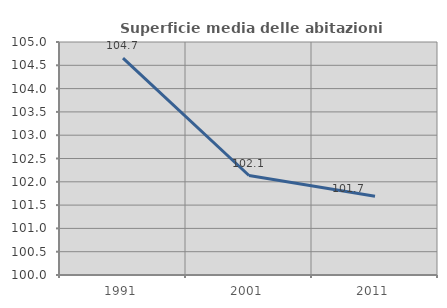
| Category | Superficie media delle abitazioni occupate |
|---|---|
| 1991.0 | 104.656 |
| 2001.0 | 102.135 |
| 2011.0 | 101.691 |